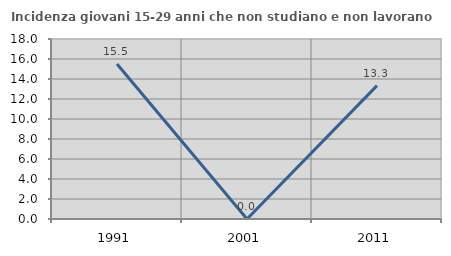
| Category | Incidenza giovani 15-29 anni che non studiano e non lavorano  |
|---|---|
| 1991.0 | 15.507 |
| 2001.0 | 0 |
| 2011.0 | 13.333 |